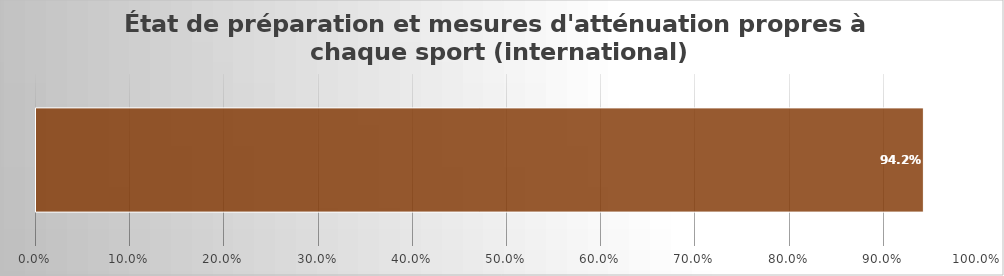
| Category | Specific Mitigation Measures |
|---|---|
| 0 | 0.942 |